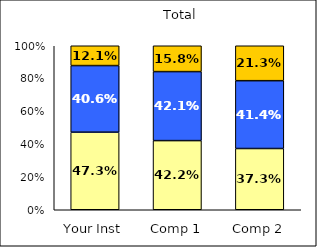
| Category | Low Science Self-Efficacy | Average Science Self-Efficacy | High Science Self-Efficacy |
|---|---|---|---|
| Your Inst | 0.473 | 0.406 | 0.121 |
| Comp 1 | 0.422 | 0.421 | 0.158 |
| Comp 2 | 0.373 | 0.414 | 0.213 |